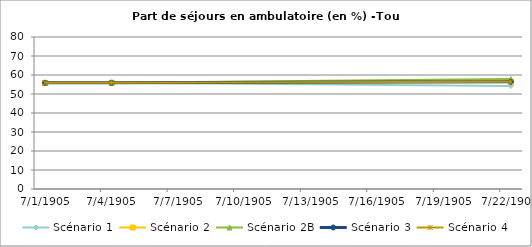
| Category | Scénario 1 | Scénario 2 | Scénario 2B | Scénario 3 | Scénario 4 |
|---|---|---|---|---|---|
| 2009.0 | 55.873 | 55.873 | 55.873 | 55.873 | 55.873 |
| 2012.0 | 55.912 | 55.912 | 55.912 | 55.912 | 55.912 |
| 2030.0 | 54.235 | 56.404 | 57.835 | 56.404 | 56.404 |